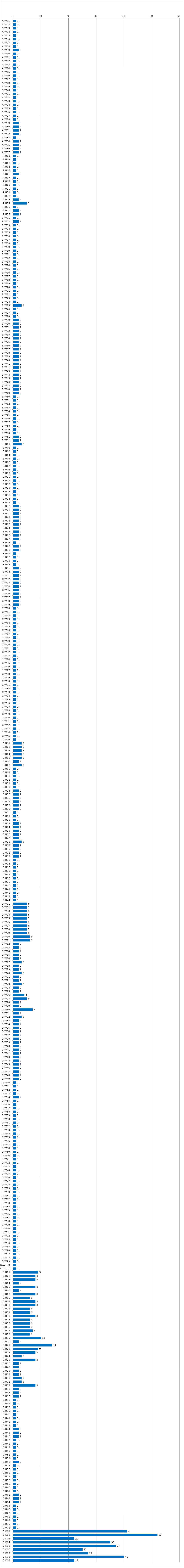
| Category | Series 0 |
|---|---|
| A.W01 | 1 |
| A.W02 | 1 |
| A.W03 | 1 |
| A.W04 | 1 |
| A.W05 | 1 |
| A.W06 | 1 |
| A.W07 | 1 |
| A.W08 | 1 |
| A.W09 | 2 |
| A.W10 | 1 |
| A.W11 | 1 |
| A.W12 | 1 |
| A.W13 | 1 |
| A.W14 | 1 |
| A.W15 | 1 |
| A.W16 | 1 |
| A.W17 | 1 |
| A.W18 | 1 |
| A.W19 | 1 |
| A.W20 | 1 |
| A.W21 | 1 |
| A.W22 | 1 |
| A.W23 | 1 |
| A.W24 | 1 |
| A.W25 | 1 |
| A.W26 | 1 |
| A.W27 | 1 |
| A.W28 | 1 |
| A.W29 | 2 |
| A.W30 | 2 |
| A.W31 | 2 |
| A.W32 | 2 |
| A.W33 | 1 |
| A.W34 | 2 |
| A.W35 | 2 |
| A.W36 | 2 |
| A.W37 | 2 |
| A.U01 | 1 |
| A.U02 | 1 |
| A.U03 | 1 |
| A.U04 | 1 |
| A.U05 | 1 |
| A.U06 | 2 |
| A.U07 | 1 |
| A.U08 | 1 |
| A.U09 | 1 |
| A.U10 | 1 |
| A.U11 | 1 |
| A.U12 | 1 |
| A.U13 | 2 |
| A.U14 | 5 |
| A.U15 | 1 |
| A.U16 | 2 |
| A.U17 | 2 |
| B.W01 | 1 |
| B.W02 | 2 |
| B.W03 | 1 |
| B.W04 | 1 |
| B.W05 | 1 |
| B.W06 | 1 |
| B.W07 | 1 |
| B.W08 | 1 |
| B.W09 | 1 |
| B.W10 | 1 |
| B.W11 | 1 |
| B.W12 | 1 |
| B.W13 | 1 |
| B.W14 | 1 |
| B.W15 | 1 |
| B.W16 | 1 |
| B.W17 | 1 |
| B.W18 | 1 |
| B.W19 | 1 |
| B.W20 | 1 |
| B.W21 | 1 |
| B.W22 | 1 |
| B.W23 | 1 |
| B.W24 | 1 |
| B.W25 | 3 |
| B.W26 | 1 |
| B.W27 | 1 |
| B.W28 | 1 |
| B.W29 | 2 |
| B.W30 | 2 |
| B.W31 | 2 |
| B.W32 | 2 |
| B.W33 | 2 |
| B.W34 | 2 |
| B.W35 | 2 |
| B.W36 | 2 |
| B.W37 | 2 |
| B.W38 | 2 |
| B.W39 | 2 |
| B.W40 | 2 |
| B.W41 | 2 |
| B.W42 | 2 |
| B.W43 | 2 |
| B.W44 | 2 |
| B.W45 | 2 |
| B.W46 | 2 |
| B.W47 | 2 |
| B.W48 | 2 |
| B.W49 | 2 |
| B.W50 | 1 |
| B.W51 | 1 |
| B.W52 | 1 |
| B.W53 | 1 |
| B.W54 | 1 |
| B.W55 | 1 |
| B.W56 | 1 |
| B.W57 | 1 |
| B.W58 | 1 |
| B.W59 | 1 |
| B.W60 | 1 |
| B.W61 | 2 |
| B.W62 | 2 |
| B.U01 | 3 |
| B.U02 | 1 |
| B.U03 | 1 |
| B.U04 | 1 |
| B.U05 | 1 |
| B.U06 | 1 |
| B.U07 | 1 |
| B.U08 | 1 |
| B.U09 | 1 |
| B.U10 | 1 |
| B.U11 | 1 |
| B.U12 | 1 |
| B.U13 | 1 |
| B.U14 | 1 |
| B.U15 | 1 |
| B.U16 | 1 |
| B.U17 | 1 |
| B.U18 | 2 |
| B.U19 | 2 |
| B.U20 | 2 |
| B.U21 | 2 |
| B.U22 | 2 |
| B.U23 | 2 |
| B.U24 | 2 |
| B.U25 | 2 |
| B.U26 | 2 |
| B.U27 | 2 |
| B.U28 | 1 |
| B.U29 | 2 |
| B.U30 | 2 |
| B.U31 | 1 |
| B.U32 | 1 |
| B.U33 | 1 |
| B.U34 | 1 |
| B.U35 | 2 |
| B.U36 | 2 |
| C.W01 | 2 |
| C.W02 | 2 |
| C.W03 | 2 |
| C.W04 | 2 |
| C.W05 | 2 |
| C.W06 | 2 |
| C.W07 | 2 |
| C.W08 | 2 |
| C.W09 | 2 |
| C.W10 | 1 |
| C.W11 | 1 |
| C.W12 | 1 |
| C.W13 | 1 |
| C.W14 | 1 |
| C.W15 | 1 |
| C.W16 | 1 |
| C.W17 | 1 |
| C.W18 | 1 |
| C.W19 | 1 |
| C.W20 | 1 |
| C.W21 | 1 |
| C.W22 | 1 |
| C.W23 | 1 |
| C.W24 | 1 |
| C.W25 | 1 |
| C.W26 | 1 |
| C.W27 | 1 |
| C.W28 | 1 |
| C.W29 | 1 |
| C.W30 | 1 |
| C.W31 | 1 |
| C.W32 | 1 |
| C.W33 | 1 |
| C.W34 | 1 |
| C.W35 | 1 |
| C.W36 | 1 |
| C.W37 | 1 |
| C.W38 | 1 |
| C.W39 | 1 |
| C.W40 | 1 |
| C.W41 | 1 |
| C.W42 | 1 |
| C.W43 | 1 |
| C.W44 | 1 |
| C.W45 | 1 |
| C.W46 | 1 |
| C.U01 | 3 |
| C.U02 | 3 |
| C.U03 | 3 |
| C.U04 | 3 |
| C.U05 | 3 |
| C.U06 | 2 |
| C.U07 | 3 |
| C.U08 | 1 |
| C.U09 | 1 |
| C.U10 | 1 |
| C.U11 | 1 |
| C.U12 | 1 |
| C.U13 | 1 |
| C.U14 | 2 |
| C.U15 | 2 |
| C.U16 | 2 |
| C.U17 | 2 |
| C.U18 | 2 |
| C.U19 | 2 |
| C.U20 | 1 |
| C.U21 | 1 |
| C.U22 | 1 |
| C.U23 | 2 |
| C.U24 | 2 |
| C.U25 | 2 |
| C.U26 | 2 |
| C.U27 | 2 |
| C.U28 | 3 |
| C.U29 | 2 |
| C.U30 | 2 |
| C.U31 | 2 |
| C.U32 | 2 |
| C.U33 | 1 |
| C.U34 | 1 |
| C.U35 | 1 |
| C.U36 | 1 |
| C.U37 | 1 |
| C.U38 | 1 |
| C.U39 | 1 |
| C.U40 | 1 |
| C.U41 | 1 |
| C.U42 | 1 |
| C.U43 | 1 |
| C.U44 | 1 |
| D.W01 | 5 |
| D.W02 | 5 |
| D.W03 | 5 |
| D.W04 | 5 |
| D.W05 | 5 |
| D.W06 | 5 |
| D.W07 | 5 |
| D.W08 | 5 |
| D.W09 | 5 |
| D.W10 | 6 |
| D.W11 | 6 |
| D.W12 | 2 |
| D.W13 | 2 |
| D.W14 | 2 |
| D.W15 | 2 |
| D.W16 | 2 |
| D.W17 | 3 |
| D.W18 | 2 |
| D.W19 | 2 |
| D.W20 | 3 |
| D.W21 | 2 |
| D.W22 | 2 |
| D.W23 | 3 |
| D.W24 | 2 |
| D.W25 | 2 |
| D.W26 | 4 |
| D.W27 | 5 |
| D.W28 | 2 |
| D.W29 | 2 |
| D.W30 | 7 |
| D.W31 | 2 |
| D.W32 | 3 |
| D.W33 | 2 |
| D.W34 | 2 |
| D.W35 | 2 |
| D.W36 | 2 |
| D.W37 | 2 |
| D.W38 | 2 |
| D.W39 | 2 |
| D.W40 | 2 |
| D.W41 | 2 |
| D.W42 | 2 |
| D.W43 | 2 |
| D.W44 | 2 |
| D.W45 | 2 |
| D.W46 | 2 |
| D.W47 | 2 |
| D.W48 | 2 |
| D.W49 | 2 |
| D.W50 | 1 |
| D.W51 | 1 |
| D.W52 | 1 |
| D.W53 | 1 |
| D.W54 | 2 |
| D.W55 | 1 |
| D.W56 | 1 |
| D.W57 | 1 |
| D.W58 | 1 |
| D.W59 | 1 |
| D.W60 | 1 |
| D.W61 | 1 |
| D.W62 | 1 |
| D.W63 | 1 |
| D.W64 | 1 |
| D.W65 | 1 |
| D.W66 | 1 |
| D.W67 | 1 |
| D.W68 | 1 |
| D.W69 | 1 |
| D.W70 | 1 |
| D.W71 | 1 |
| D.W72 | 1 |
| D.W73 | 1 |
| D.W74 | 1 |
| D.W75 | 1 |
| D.W76 | 1 |
| D.W77 | 1 |
| D.W78 | 1 |
| D.W79 | 1 |
| D.W80 | 1 |
| D.W81 | 1 |
| D.W82 | 1 |
| D.W83 | 1 |
| D.W84 | 1 |
| D.W85 | 1 |
| D.W86 | 1 |
| D.W87 | 1 |
| D.W88 | 1 |
| D.W89 | 1 |
| D.W90 | 1 |
| D.W91 | 1 |
| D.W92 | 1 |
| D.W93 | 1 |
| D.W94 | 1 |
| D.W85 | 1 |
| D.W96 | 1 |
| D.W97 | 1 |
| D.W98 | 1 |
| D.W99 | 1 |
| D.W100 | 1 |
| D.W101 | 1 |
| D.U01 | 9 |
| D.U02 | 8 |
| D.U03 | 8 |
| D.U04 | 2 |
| D.U05 | 8 |
| D.U06 | 2 |
| D.U07 | 8 |
| D.U08 | 6 |
| D.U09 | 8 |
| D.U10 | 8 |
| D.U11 | 6 |
| D.U12 | 6 |
| D.U13 | 8 |
| D.U14 | 6 |
| D.U15 | 6 |
| D.U16 | 6 |
| D.U17 | 7 |
| D.U18 | 6 |
| D.U19 | 10 |
| D.U20 | 2 |
| D.U21 | 14 |
| D.U22 | 9 |
| D.U23 | 8 |
| D.U24 | 3 |
| D.U25 | 8 |
| D.U26 | 2 |
| D.U27 | 2 |
| D.U28 | 2 |
| D.U29 | 2 |
| D.U30 | 3 |
| D.U31 | 3 |
| D.U32 | 8 |
| D.U33 | 2 |
| D.U34 | 2 |
| D.U35 | 2 |
| D.U36 | 1 |
| D.U37 | 1 |
| D.U38 | 1 |
| D.U39 | 1 |
| D.U40 | 1 |
| D.U41 | 1 |
| D.U42 | 1 |
| D.U43 | 1 |
| D.U44 | 2 |
| D.U45 | 2 |
| D.U46 | 2 |
| D.U47 | 1 |
| D.U48 | 1 |
| D.U49 | 1 |
| D.U50 | 1 |
| D.U51 | 1 |
| D.U52 | 1 |
| D.U53 | 2 |
| D.U54 | 1 |
| D.U55 | 1 |
| D.U56 | 1 |
| D.U57 | 1 |
| D.U58 | 1 |
| D.U59 | 1 |
| D.U60 | 1 |
| D.U61 | 1 |
| D.U62 | 2 |
| D.U63 | 2 |
| D.U64 | 2 |
| D.U65 | 1 |
| D.U66 | 1 |
| D.U67 | 1 |
| D.U68 | 1 |
| D.U69 | 1 |
| D.U70 | 1 |
| D.U71 | 1 |
| D.K01 | 41 |
| D.K02 | 52 |
| D.K03 | 22 |
| D.K04 | 35 |
| D.K05 | 37 |
| D.K06 | 25 |
| D.K07 | 27 |
| D.K08 | 40 |
| D.K09 | 22 |